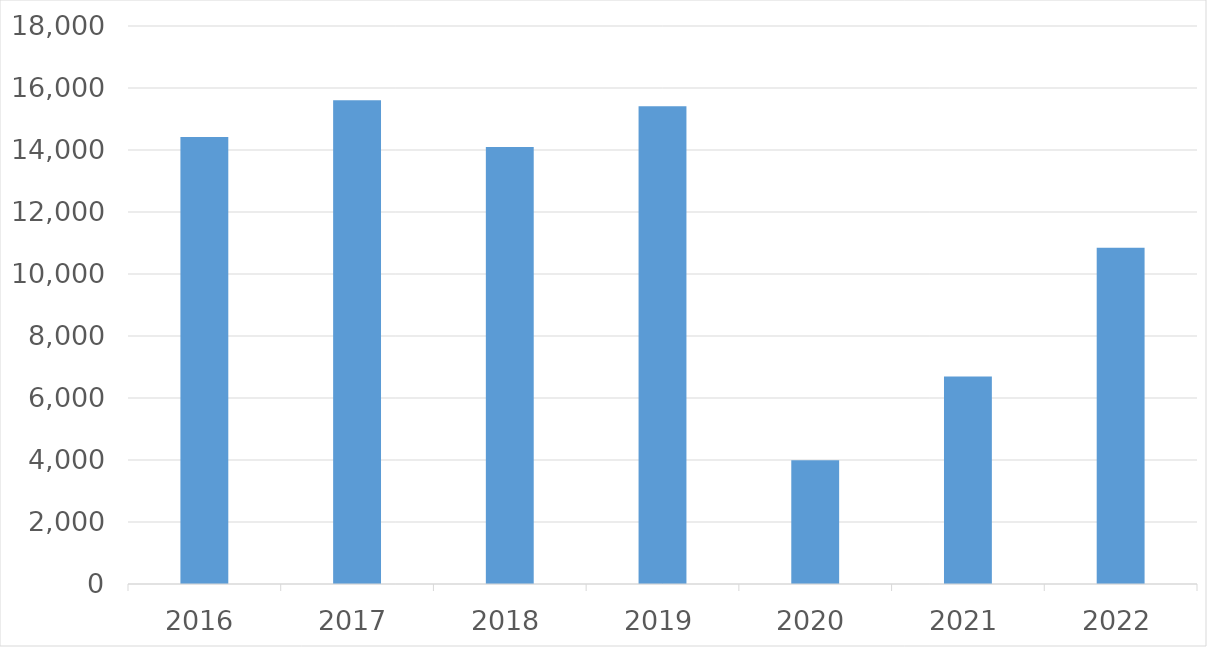
| Category | Series 0 |
|---|---|
| 2016 | 14417 |
| 2017 | 15601 |
| 2018 | 14100 |
| 2019 | 15411 |
| 2020 | 3994 |
| 2021 | 6693 |
| 2022 | 10849 |